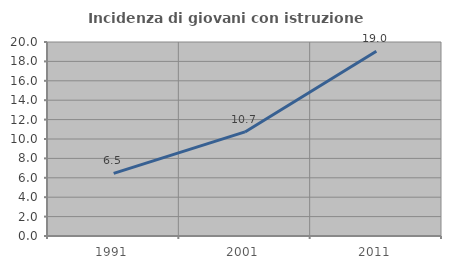
| Category | Incidenza di giovani con istruzione universitaria |
|---|---|
| 1991.0 | 6.462 |
| 2001.0 | 10.73 |
| 2011.0 | 19.04 |